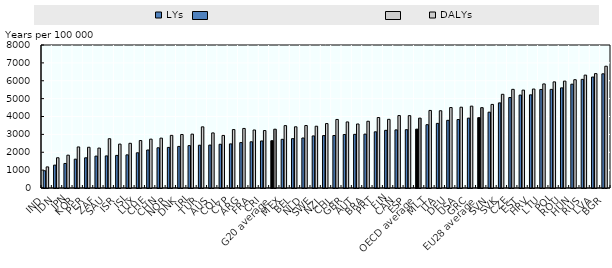
| Category | LYs | DALYs |
|---|---|---|
| IND | 965.56 | 1180.439 |
| IDN | 1279.045 | 1692.228 |
| JPN | 1372.82 | 1836.856 |
| KOR | 1612.877 | 2296.928 |
| PER | 1688.707 | 2278.836 |
| ZAF | 1783.25 | 2233.375 |
| SAU | 1794.886 | 2757.025 |
| ISR | 1823.909 | 2455.455 |
| ISL | 1853.668 | 2500.2 |
| LUX | 1969.712 | 2654.921 |
| CHE | 2125.629 | 2732.648 |
| CHN | 2249.886 | 2789.861 |
| NOR | 2270.807 | 2944.305 |
| DNK | 2325.884 | 2993.161 |
| IRL | 2371.712 | 3013.986 |
| TUR | 2392.791 | 3420.967 |
| AUS | 2399.859 | 3081.509 |
| COL | 2446.655 | 2941.201 |
| CYP | 2467.016 | 3268.815 |
| ARG | 2540.567 | 3331.791 |
| FRA | 2585.142 | 3245.462 |
| CRI | 2630.859 | 3213.773 |
| G20 average | 2645.659 | 3289.331 |
| MEX | 2723.751 | 3490.287 |
| BEL | 2761.187 | 3423.64 |
| NLD | 2796.521 | 3495.138 |
| SWE | 2913.117 | 3456.206 |
| NZL | 2931.229 | 3604.341 |
| CHL | 2937.744 | 3834.431 |
| GBR | 2993.232 | 3695.259 |
| AUT | 3001.092 | 3581.148 |
| BRA | 3014.258 | 3733.954 |
| PRT | 3142.733 | 3943.147 |
| FIN | 3225.613 | 3841.605 |
| CAN | 3250.524 | 4053.149 |
| ESP | 3261.722 | 4048.107 |
| OECD average | 3291.366 | 3908.187 |
| MLT | 3541.825 | 4338.8 |
| ITA | 3615.024 | 4322.361 |
| DEU | 3786.664 | 4501.182 |
| USA | 3830.127 | 4519.397 |
| GRC | 3908.066 | 4580.418 |
| EU28 average | 3934.706 | 4494.989 |
| SVN | 4241.367 | 4676.27 |
| SVK | 4760.932 | 5241.846 |
| CZE | 5061.298 | 5519.012 |
| EST | 5197.244 | 5475.564 |
| HRV | 5210.697 | 5535.99 |
| LTU | 5512.584 | 5821.871 |
| POL | 5517.073 | 5936.676 |
| ROU | 5601.29 | 5979.061 |
| HUN | 5808.068 | 6058.444 |
| RUS | 6077.264 | 6315.263 |
| LVA | 6207.455 | 6398.835 |
| BGR | 6387.486 | 6812.768 |